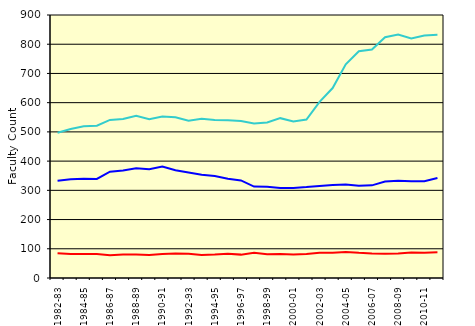
| Category | Schools of Arts, Sciences, & Engineering | Eastman School of Music | School of Medicine & Dentistry |
|---|---|---|---|
| 1982-83 | 333 | 85 | 497 |
| 1983-84 | 338 | 82 | 510 |
| 1984-85 | 340 | 82 | 519 |
| 1985-86 | 339 | 82 | 521 |
| 1986-87 | 364 | 78 | 541 |
| 1987-88 | 368 | 80 | 544 |
| 1988-89 | 375.5 | 80 | 555 |
| 1989-90 | 372.5 | 79 | 543 |
| 1990-91 | 381.5 | 82 | 553 |
| 1991-92 | 368.5 | 84 | 550 |
| 1992-93 | 361 | 83 | 538 |
| 1993-94 | 353 | 79 | 545 |
| 1994-95 | 349 | 80 | 541 |
| 1995-96 | 340 | 83 | 540 |
| 1996-97 | 334 | 80 | 537 |
| 1997-98 | 313 | 86 | 529 |
| 1998-99 | 312 | 81 | 532 |
| 1999-00 | 308 | 82 | 547 |
| 2000-01 | 308 | 80 | 536 |
| 2001-02 | 311 | 82 | 542 |
| 2002-03 | 315 | 86 | 603 |
| 2003-04 | 318 | 86 | 650 |
| 2004-05 | 320 | 89 | 731 |
| 2005-06 | 316 | 86 | 776 |
| 2006-07 | 317 | 84 | 782 |
| 2007-08 | 330 | 83 | 824 |
| 2008-09 | 333 | 84 | 833 |
| 2009-10 | 331 | 87 | 820 |
| 2010-11 | 331 | 86 | 830 |
| 2011-12 | 342 | 88 | 832 |